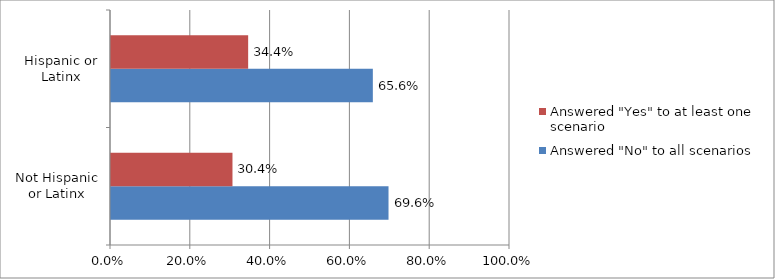
| Category | Answered "No" to all scenarios | Answered "Yes" to at least one scenario |
|---|---|---|
| Not Hispanic or Latinx | 0.696 | 0.304 |
| Hispanic or Latinx | 0.656 | 0.344 |